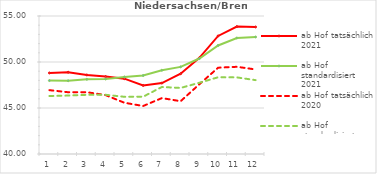
| Category | ab Hof tatsächlich 2021 | ab Hof standardisiert 2021 | ab Hof tatsächlich 2020 | ab Hof standardisiert 2020 |
|---|---|---|---|---|
| 0 | 48.809 | 47.982 | 46.94 | 46.301 |
| 1 | 48.89 | 47.963 | 46.715 | 46.352 |
| 2 | 48.591 | 48.118 | 46.717 | 46.434 |
| 3 | 48.414 | 48.148 | 46.402 | 46.436 |
| 4 | 48.19 | 48.381 | 45.573 | 46.218 |
| 5 | 47.456 | 48.531 | 45.217 | 46.23 |
| 6 | 47.708 | 49.106 | 46.076 | 47.283 |
| 7 | 48.724 | 49.471 | 45.74 | 47.181 |
| 8 | 50.451 | 50.377 | 47.579 | 47.745 |
| 9 | 52.834 | 51.799 | 49.381 | 48.34 |
| 10 | 53.846 | 52.609 | 49.478 | 48.327 |
| 11 | 53.807 | 52.718 | 49.191 | 48.028 |